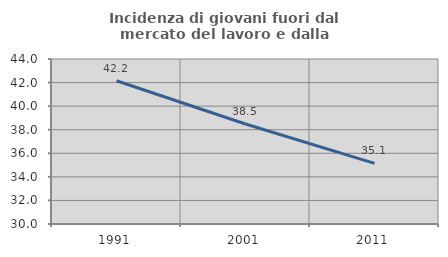
| Category | Incidenza di giovani fuori dal mercato del lavoro e dalla formazione  |
|---|---|
| 1991.0 | 42.157 |
| 2001.0 | 38.483 |
| 2011.0 | 35.145 |